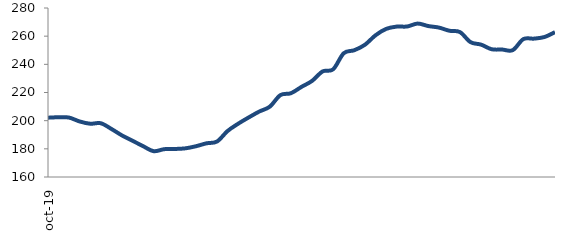
| Category | Series 0 |
|---|---|
| 2019-10-01 | 202.111 |
| 2019-11-01 | 202.424 |
| 2019-12-01 | 202.177 |
| 2020-01-01 | 199.409 |
| 2020-02-01 | 197.826 |
| 2020-03-01 | 198.161 |
| 2020-04-01 | 194.123 |
| 2020-05-01 | 189.538 |
| 2020-06-01 | 185.731 |
| 2020-07-01 | 181.914 |
| 2020-08-01 | 178.343 |
| 2020-09-01 | 179.758 |
| 2020-10-01 | 179.9 |
| 2020-11-01 | 180.346 |
| 2020-12-01 | 181.827 |
| 2021-01-01 | 183.909 |
| 2021-02-01 | 185.191 |
| 2021-03-01 | 192.66 |
| 2021-04-01 | 197.814 |
| 2021-05-01 | 202.28 |
| 2021-06-01 | 206.474 |
| 2021-07-01 | 209.951 |
| 2021-08-01 | 218.146 |
| 2021-09-01 | 219.495 |
| 2021-10-01 | 224.001 |
| 2021-11-01 | 228.234 |
| 2021-12-01 | 234.966 |
| 2022-01-01 | 236.495 |
| 2022-02-01 | 247.883 |
| 2022-03-01 | 250.016 |
| 2022-04-01 | 253.872 |
| 2022-05-01 | 260.574 |
| 2022-06-01 | 265.125 |
| 2022-07-01 | 266.79 |
| 2022-08-01 | 266.867 |
| 2022-09-01 | 268.948 |
| 2022-10-01 | 267.186 |
| 2022-11-01 | 266.12 |
| 2022-12-01 | 263.849 |
| 2023-01-01 | 262.911 |
| 2023-02-01 | 255.756 |
| 2023-03-01 | 253.995 |
| 2023-04-01 | 250.72 |
| 2023-05-01 | 250.501 |
| 2023-06-01 | 250.068 |
| 2023-07-01 | 257.894 |
| 2023-08-01 | 258.252 |
| 2023-09-01 | 259.395 |
| 2023-10-01 | 262.829 |